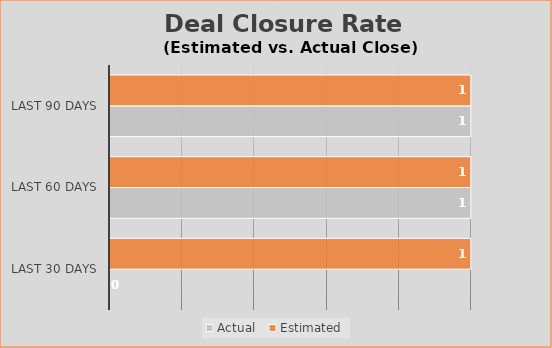
| Category | Actual  | Estimated |
|---|---|---|
| Last 30 Days | 0 | 1 |
| Last 60 Days | 1 | 1 |
| Last 90 Days | 1 | 1 |